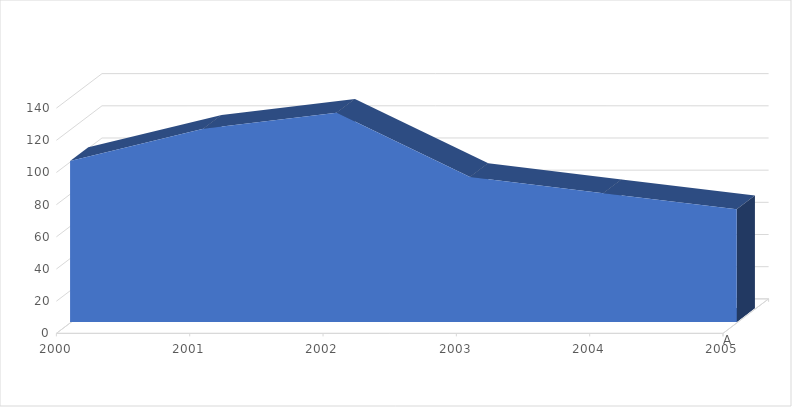
| Category | A |
|---|---|
| 2000.0 | 100 |
| 2001.0 | 120 |
| 2002.0 | 130 |
| 2003.0 | 90 |
| 2004.0 | 80 |
| 2005.0 | 70 |